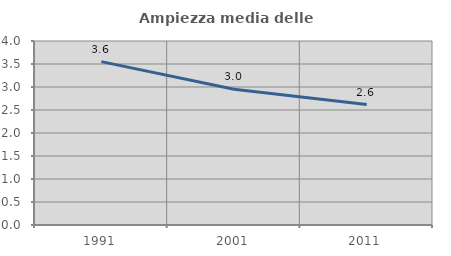
| Category | Ampiezza media delle famiglie |
|---|---|
| 1991.0 | 3.552 |
| 2001.0 | 2.951 |
| 2011.0 | 2.619 |